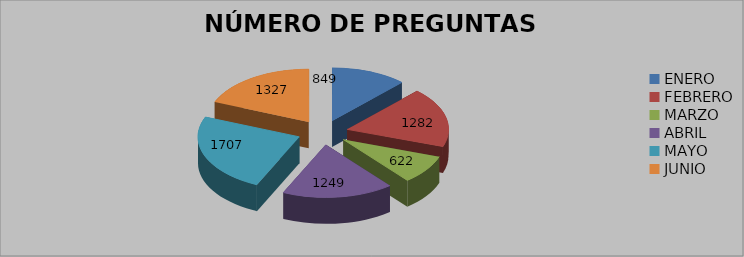
| Category | Series 0 |
|---|---|
| ENERO | 849 |
| FEBRERO | 1282 |
| MARZO | 622 |
| ABRIL | 1249 |
| MAYO | 1707 |
| JUNIO | 1327 |